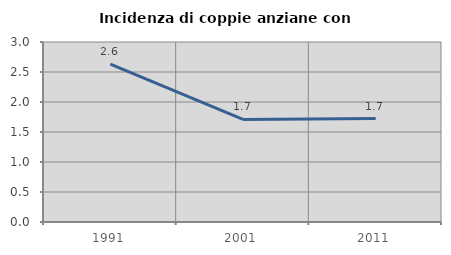
| Category | Incidenza di coppie anziane con figli |
|---|---|
| 1991.0 | 2.632 |
| 2001.0 | 1.709 |
| 2011.0 | 1.724 |